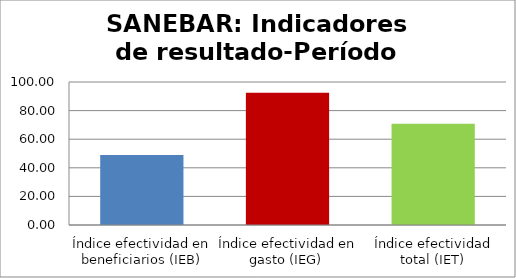
| Category | Series 0 |
|---|---|
| Índice efectividad en beneficiarios (IEB) | 49.021 |
| Índice efectividad en gasto (IEG)  | 92.545 |
| Índice efectividad total (IET) | 70.783 |